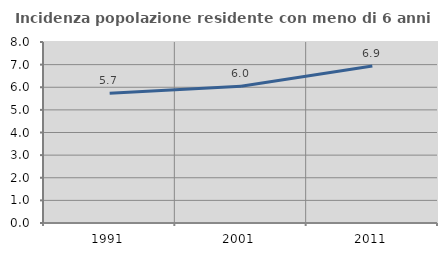
| Category | Incidenza popolazione residente con meno di 6 anni |
|---|---|
| 1991.0 | 5.73 |
| 2001.0 | 6.042 |
| 2011.0 | 6.941 |